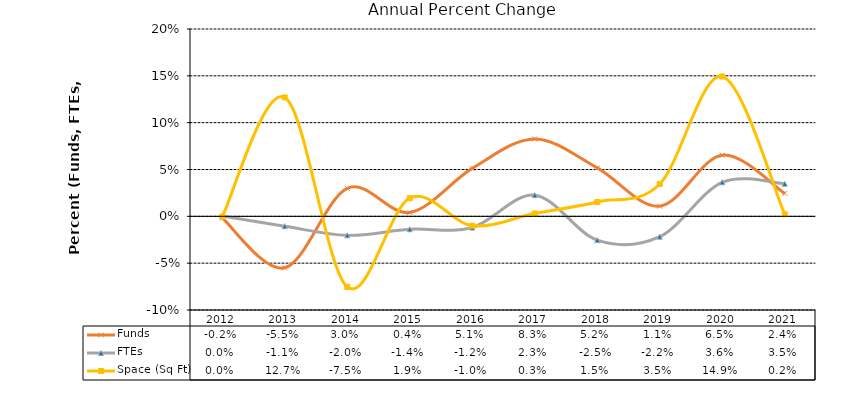
| Category | Funds | FTEs | Space (Sq Ft) |
|---|---|---|---|
| 2012.0 | -0.002 | 0 | 0 |
| 2013.0 | -0.055 | -0.011 | 0.127 |
| 2014.0 | 0.03 | -0.02 | -0.075 |
| 2015.0 | 0.004 | -0.014 | 0.019 |
| 2016.0 | 0.051 | -0.012 | -0.01 |
| 2017.0 | 0.083 | 0.023 | 0.003 |
| 2018.0 | 0.052 | -0.025 | 0.015 |
| 2019.0 | 0.011 | -0.022 | 0.035 |
| 2020.0 | 0.065 | 0.036 | 0.149 |
| 2021.0 | 0.024 | 0.035 | 0.002 |